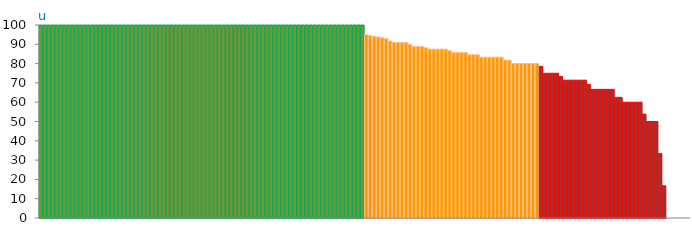
| Category | Top Quartile | 2nd Quartile | 3rd Quartile | Bottom Quartile | Series 4 |
|---|---|---|---|---|---|
|  | 100 | 0 | 0 | 0 | 100 |
| u | 100 | 0 | 0 | 0 | 100 |